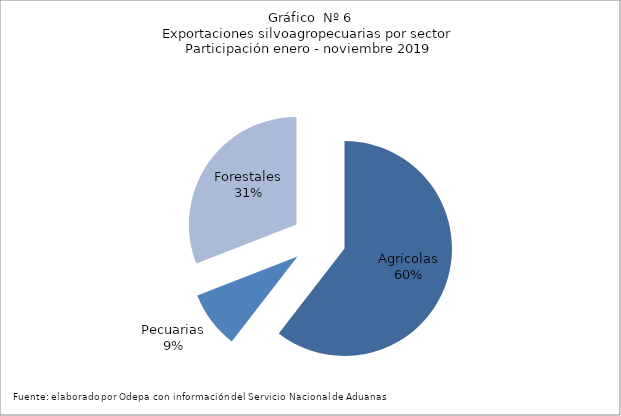
| Category | Series 0 |
|---|---|
| Agrícolas | 9196792 |
| Pecuarias | 1309724 |
| Forestales | 4701942 |